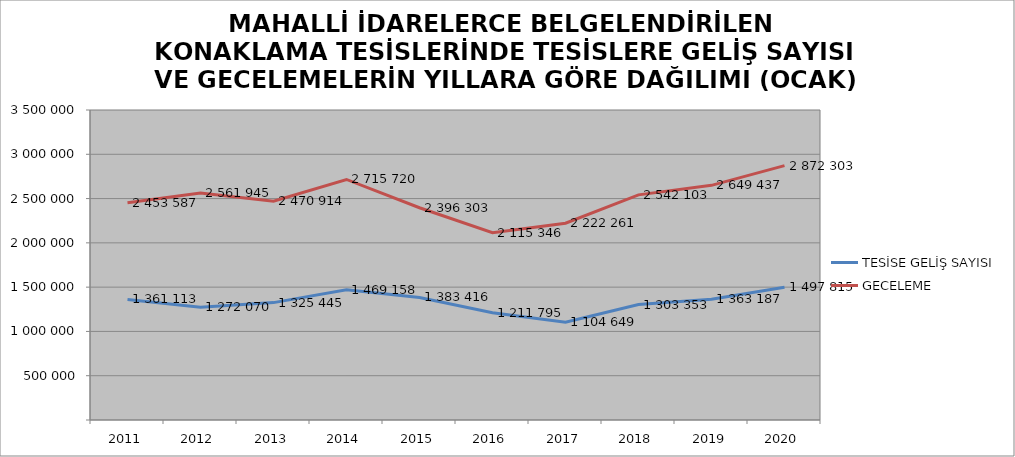
| Category | TESİSE GELİŞ SAYISI | GECELEME |
|---|---|---|
| 2011 | 1361113 | 2453587 |
| 2012 | 1272070 | 2561945 |
| 2013 | 1325445 | 2470914 |
| 2014 | 1469158 | 2715720 |
| 2015 | 1383416 | 2396303 |
| 2016 | 1211795 | 2115346 |
| 2017 | 1104649 | 2222261 |
| 2018 | 1303353 | 2542103 |
| 2019 | 1363187 | 2649437 |
| 2020 | 1497815 | 2872303 |